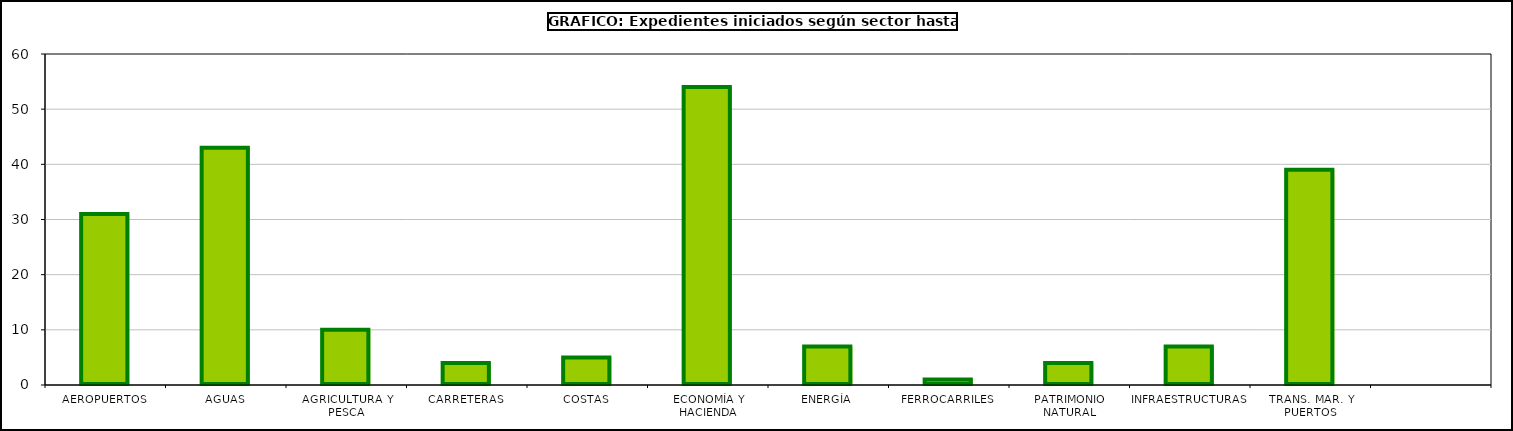
| Category | Series 0 |
|---|---|
| AEROPUERTOS | 31 |
| AGUAS | 43 |
| AGRICULTURA Y PESCA | 10 |
| CARRETERAS | 4 |
| COSTAS | 5 |
| ECONOMÍA Y HACIENDA | 54 |
| ENERGÍA | 7 |
| FERROCARRILES | 1 |
| PATRIMONIO NATURAL | 4 |
| INFRAESTRUCTURAS | 7 |
| TRANS. MAR. Y PUERTOS | 39 |